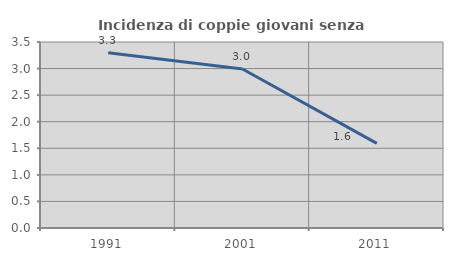
| Category | Incidenza di coppie giovani senza figli |
|---|---|
| 1991.0 | 3.298 |
| 2001.0 | 2.991 |
| 2011.0 | 1.593 |